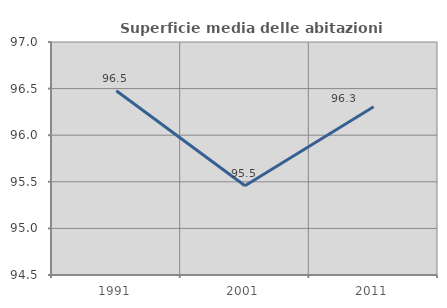
| Category | Superficie media delle abitazioni occupate |
|---|---|
| 1991.0 | 96.476 |
| 2001.0 | 95.458 |
| 2011.0 | 96.305 |